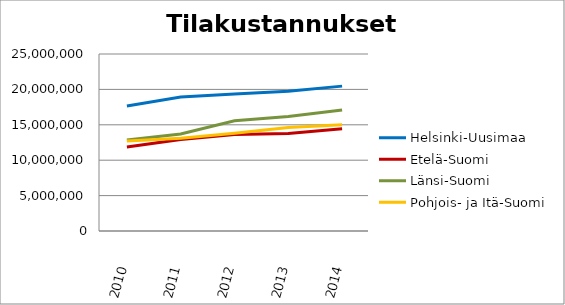
| Category | Helsinki-Uusimaa | Etelä-Suomi | Länsi-Suomi | Pohjois- ja Itä-Suomi |
|---|---|---|---|---|
| 2010.0 | 17665697.74 | 11860096.43 | 12841055.53 | 12699208.9 |
| 2011.0 | 18929689.71 | 12928410.21 | 13695878.72 | 13101838.33 |
| 2012.0 | 19337927.34 | 13624823.41 | 15559664.06 | 13802716.53 |
| 2013.0 | 19749448.6 | 13784368.42 | 16185299.56 | 14609058.61 |
| 2014.0 | 20463438.41 | 14449433.84 | 17091620.9 | 15010277.79 |